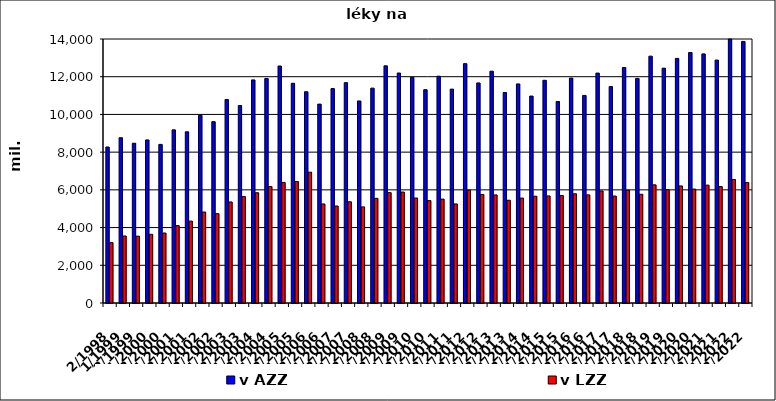
| Category | v AZZ | v LZZ |
|---|---|---|
| 2/1998 | 8272741.942 | 3200438.109 |
| 1/1999 | 8764234.255 | 3554511.928 |
| 2/1999 | 8471022.516 | 3545205.301 |
| 1/2000 | 8649107.833 | 3642394.968 |
| 2/2000 | 8411341.656 | 3712055.742 |
| 1/2001 | 9182428.931 | 4103446.04 |
| 2/2001 | 9076925.487 | 4342756.484 |
| 1/2002 | 9950747 | 4824901 |
| 2/2002 | 9616100 | 4737854 |
| 1/2003 | 10790389 | 5358398 |
| 2/2003 | 10469824.177 | 5643690.883 |
| 1/2004 | 11832026.615 | 5846797.016 |
| 2/2004 | 11906890.69 | 6178135.642 |
| 1/2005 | 12567081 | 6394301 |
| 2/2005 | 11651812.337 | 6442128.315 |
| 1/2006 | 11204013 | 6937554 |
| 2/2006 | 10546441.588 | 5253703.412 |
| 1/2007 | 11370748.356 | 5144407.644 |
| 2/2007 | 11684649.644 | 5367827.356 |
| 1/2008 | 10714532 | 5095324 |
| 2/2008 | 11394498 | 5550202 |
| 1/2009 | 12576089 | 5852792 |
| 2/2009 | 12195839 | 5884289 |
| 1/2010 | 11968899 | 5567680 |
| 2/2010 | 11311774 | 5430248 |
| 1/2011 | 12028759 | 5510002 |
| 2/2011 | 11341789 | 5253446 |
| 1/2012 | 12692977 | 5984968 |
| 2/2012 | 11670435 | 5755521 |
| 1/2013 | 12293827 | 5730255 |
| 2/2013 | 11160324 | 5448904 |
| 1/2014 | 11617993 | 5564668 |
| 2/2014 | 10974704 | 5662559 |
| 1/2015 | 11810356 | 5677912 |
| 2/2015 | 10684682 | 5702795 |
| 1/2016 | 11926658.38 | 5792716.62 |
| 2/2016 | 11007438.355 | 5735723.645 |
| 1/2017 | 12192365 | 5942299 |
| 2/2017 | 11476680 | 5672344 |
| 1/2018 | 12489873.642 | 5981613.234 |
| 2/2018 | 11909761.498 | 5766727.988 |
| 1/2019 | 13090421.27 | 6266247.14 |
| 2/2019 | 12452988.369 | 6011431.583 |
| 1/2020 | 12970910.83 | 6208460.37 |
| 2/2020 | 13282266.17 | 6041741.993 |
| 1/2021 | 13210982.444 | 6251022.596 |
| 2/2021 | 12882896.915 | 6174471.462 |
| 1/2022 | 14244121.65 | 6551702.33 |
| 2/2022 | 13872370.17 | 6389858.459 |